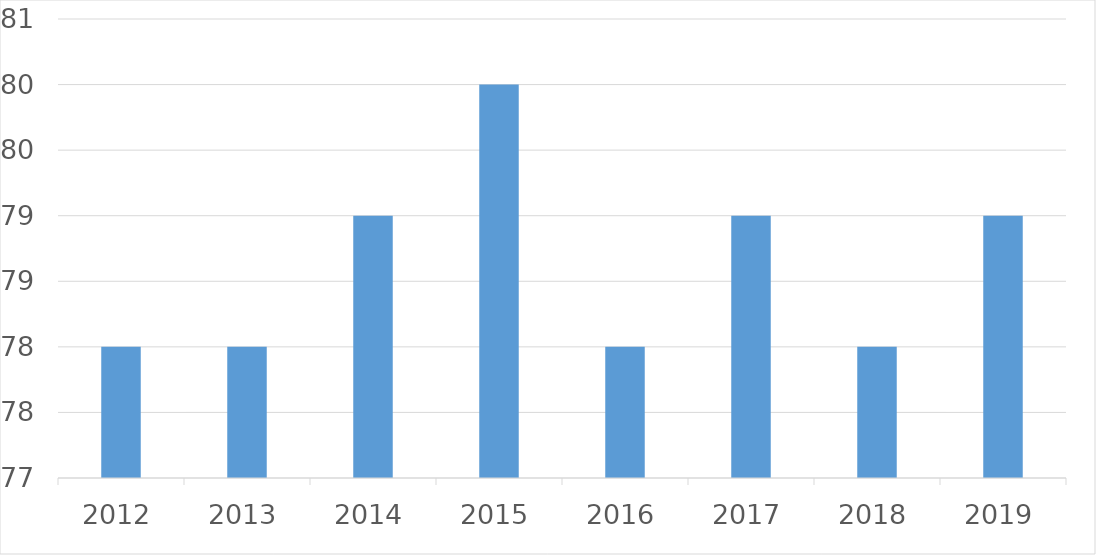
| Category | Series 0 |
|---|---|
| 2012 | 78 |
| 2013 | 78 |
| 2014 | 79 |
| 2015 | 80 |
| 2016 | 78 |
| 2017 | 79 |
| 2018 | 78 |
| 2019 | 79 |